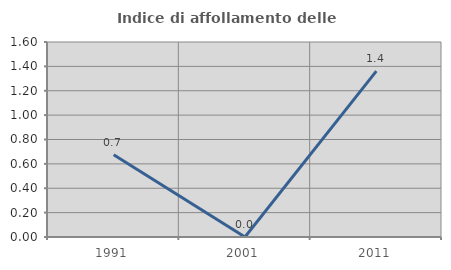
| Category | Indice di affollamento delle abitazioni  |
|---|---|
| 1991.0 | 0.676 |
| 2001.0 | 0 |
| 2011.0 | 1.361 |